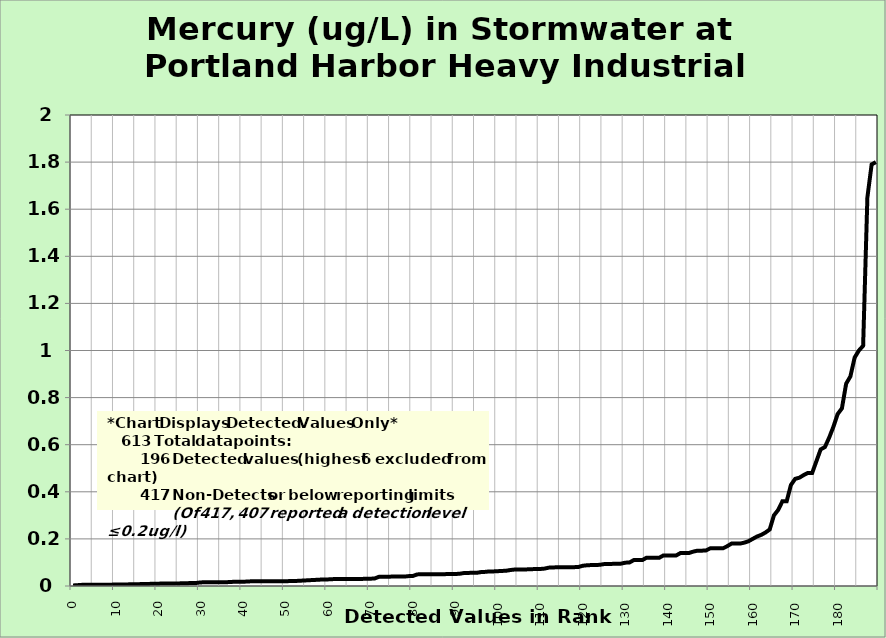
| Category | Mercury |
|---|---|
| 0.0 | 0.002 |
| 1.0 | 0.003 |
| 2.0 | 0.005 |
| 3.0 | 0.005 |
| 4.0 | 0.005 |
| 5.0 | 0.005 |
| 6.0 | 0.005 |
| 7.0 | 0.005 |
| 8.0 | 0.005 |
| 9.0 | 0.006 |
| 10.0 | 0.006 |
| 11.0 | 0.007 |
| 12.0 | 0.007 |
| 13.0 | 0.007 |
| 14.0 | 0.007 |
| 15.0 | 0.008 |
| 16.0 | 0.008 |
| 17.0 | 0.009 |
| 18.0 | 0.009 |
| 19.0 | 0.01 |
| 20.0 | 0.01 |
| 21.0 | 0.011 |
| 22.0 | 0.011 |
| 23.0 | 0.011 |
| 24.0 | 0.011 |
| 25.0 | 0.011 |
| 26.0 | 0.012 |
| 27.0 | 0.012 |
| 28.0 | 0.013 |
| 29.0 | 0.013 |
| 30.0 | 0.015 |
| 31.0 | 0.016 |
| 32.0 | 0.016 |
| 33.0 | 0.016 |
| 34.0 | 0.016 |
| 35.0 | 0.016 |
| 36.0 | 0.016 |
| 37.0 | 0.017 |
| 38.0 | 0.018 |
| 39.0 | 0.018 |
| 40.0 | 0.018 |
| 41.0 | 0.019 |
| 42.0 | 0.02 |
| 43.0 | 0.02 |
| 44.0 | 0.02 |
| 45.0 | 0.02 |
| 46.0 | 0.02 |
| 47.0 | 0.02 |
| 48.0 | 0.02 |
| 49.0 | 0.02 |
| 50.0 | 0.02 |
| 51.0 | 0.021 |
| 52.0 | 0.021 |
| 53.0 | 0.022 |
| 54.0 | 0.023 |
| 55.0 | 0.024 |
| 56.0 | 0.025 |
| 57.0 | 0.026 |
| 58.0 | 0.027 |
| 59.0 | 0.027 |
| 60.0 | 0.028 |
| 61.0 | 0.029 |
| 62.0 | 0.03 |
| 63.0 | 0.03 |
| 64.0 | 0.03 |
| 65.0 | 0.03 |
| 66.0 | 0.03 |
| 67.0 | 0.03 |
| 68.0 | 0.03 |
| 69.0 | 0.031 |
| 70.0 | 0.031 |
| 71.0 | 0.032 |
| 72.0 | 0.039 |
| 73.0 | 0.039 |
| 74.0 | 0.039 |
| 75.0 | 0.04 |
| 76.0 | 0.04 |
| 77.0 | 0.04 |
| 78.0 | 0.04 |
| 79.0 | 0.042 |
| 80.0 | 0.043 |
| 81.0 | 0.049 |
| 82.0 | 0.05 |
| 83.0 | 0.05 |
| 84.0 | 0.05 |
| 85.0 | 0.05 |
| 86.0 | 0.05 |
| 87.0 | 0.05 |
| 88.0 | 0.051 |
| 89.0 | 0.051 |
| 90.0 | 0.051 |
| 91.0 | 0.052 |
| 92.0 | 0.055 |
| 93.0 | 0.056 |
| 94.0 | 0.056 |
| 95.0 | 0.056 |
| 96.0 | 0.059 |
| 97.0 | 0.06 |
| 98.0 | 0.062 |
| 99.0 | 0.062 |
| 100.0 | 0.063 |
| 101.0 | 0.064 |
| 102.0 | 0.065 |
| 103.0 | 0.068 |
| 104.0 | 0.07 |
| 105.0 | 0.07 |
| 106.0 | 0.07 |
| 107.0 | 0.071 |
| 108.0 | 0.072 |
| 109.0 | 0.072 |
| 110.0 | 0.072 |
| 111.0 | 0.074 |
| 112.0 | 0.078 |
| 113.0 | 0.078 |
| 114.0 | 0.08 |
| 115.0 | 0.08 |
| 116.0 | 0.08 |
| 117.0 | 0.08 |
| 118.0 | 0.08 |
| 119.0 | 0.081 |
| 120.0 | 0.086 |
| 121.0 | 0.088 |
| 122.0 | 0.089 |
| 123.0 | 0.089 |
| 124.0 | 0.09 |
| 125.0 | 0.093 |
| 126.0 | 0.093 |
| 127.0 | 0.094 |
| 128.0 | 0.095 |
| 129.0 | 0.095 |
| 130.0 | 0.099 |
| 131.0 | 0.1 |
| 132.0 | 0.11 |
| 133.0 | 0.11 |
| 134.0 | 0.11 |
| 135.0 | 0.12 |
| 136.0 | 0.12 |
| 137.0 | 0.12 |
| 138.0 | 0.12 |
| 139.0 | 0.13 |
| 140.0 | 0.13 |
| 141.0 | 0.13 |
| 142.0 | 0.13 |
| 143.0 | 0.14 |
| 144.0 | 0.14 |
| 145.0 | 0.14 |
| 146.0 | 0.146 |
| 147.0 | 0.15 |
| 148.0 | 0.15 |
| 149.0 | 0.151 |
| 150.0 | 0.16 |
| 151.0 | 0.16 |
| 152.0 | 0.16 |
| 153.0 | 0.16 |
| 154.0 | 0.169 |
| 155.0 | 0.18 |
| 156.0 | 0.18 |
| 157.0 | 0.18 |
| 158.0 | 0.184 |
| 159.0 | 0.19 |
| 160.0 | 0.2 |
| 161.0 | 0.21 |
| 162.0 | 0.217 |
| 163.0 | 0.227 |
| 164.0 | 0.24 |
| 165.0 | 0.3 |
| 166.0 | 0.323 |
| 167.0 | 0.36 |
| 168.0 | 0.36 |
| 169.0 | 0.429 |
| 170.0 | 0.455 |
| 171.0 | 0.46 |
| 172.0 | 0.471 |
| 173.0 | 0.48 |
| 174.0 | 0.48 |
| 175.0 | 0.53 |
| 176.0 | 0.58 |
| 177.0 | 0.59 |
| 178.0 | 0.63 |
| 179.0 | 0.676 |
| 180.0 | 0.73 |
| 181.0 | 0.754 |
| 182.0 | 0.859 |
| 183.0 | 0.89 |
| 184.0 | 0.97 |
| 185.0 | 1 |
| 186.0 | 1.02 |
| 187.0 | 1.65 |
| 188.0 | 1.79 |
| 189.0 | 1.8 |